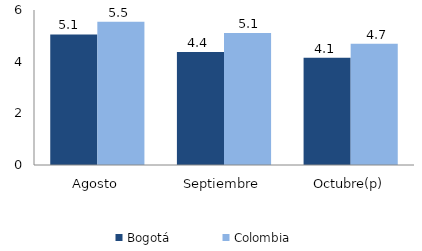
| Category | Bogotá | Colombia |
|---|---|---|
| Agosto | 5.054 | 5.543 |
| Septiembre | 4.376 | 5.108 |
| Octubre(p) | 4.148 | 4.695 |